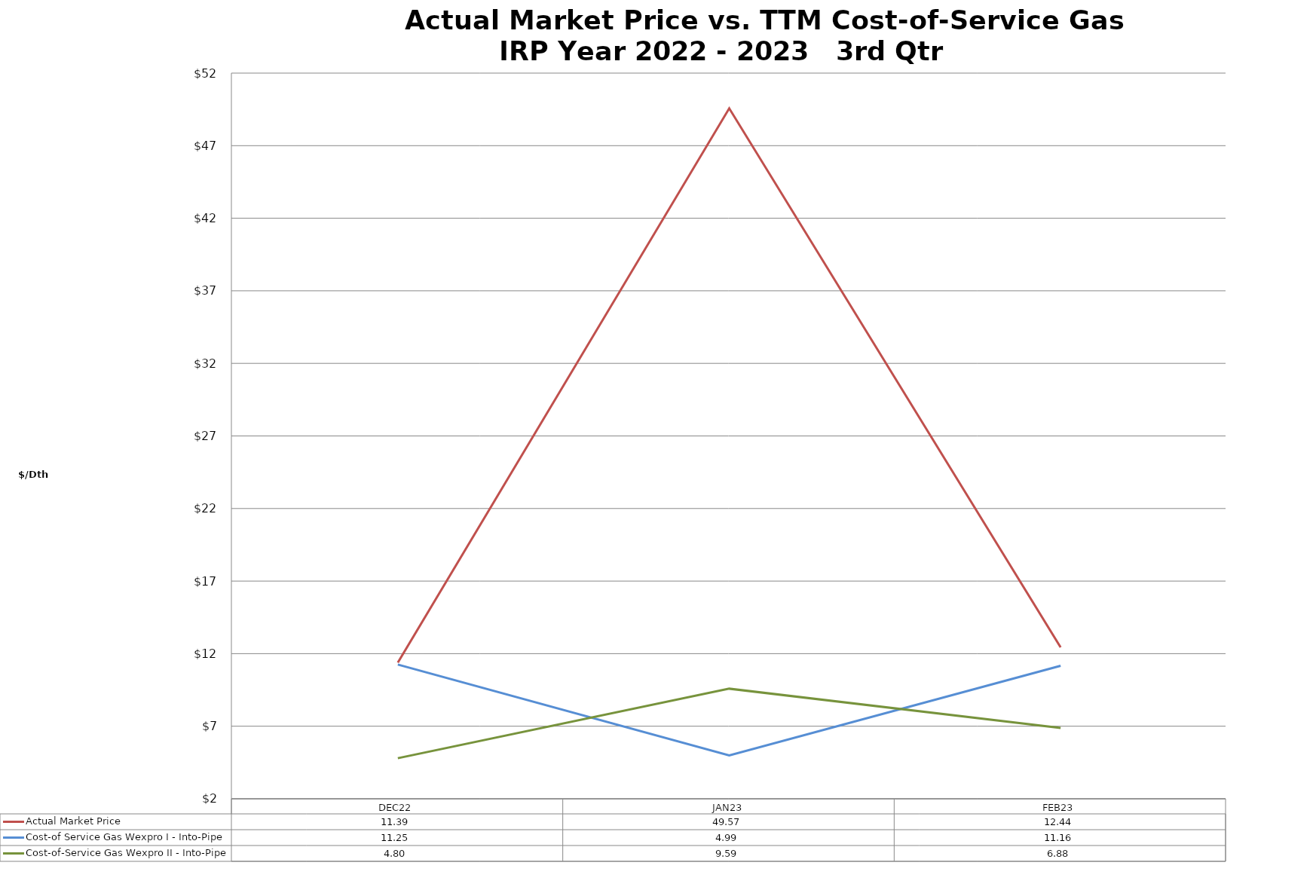
| Category | Actual Market Price | Cost-of Service Gas Wexpro I - Into-Pipe | Cost-of-Service Gas Wexpro II - Into-Pipe |
|---|---|---|---|
| DEC22 | 11.39 | 11.25 | 4.796 |
| JAN23 | 49.57 | 4.994 | 9.586 |
| FEB23 | 12.44 | 11.161 | 6.883 |